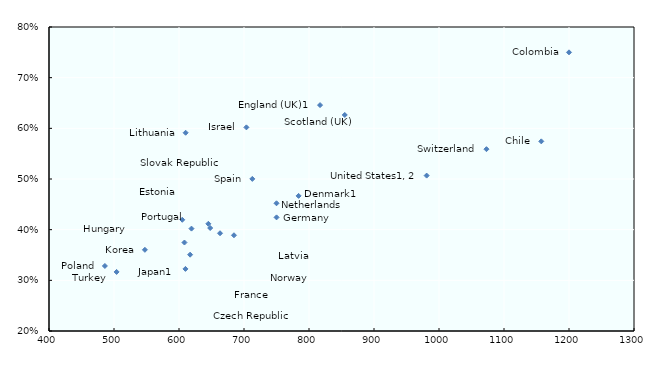
| Category | Series 8 |
|---|---|
| 1200.0 | 0.75 |
| 817.0 | 0.646 |
| 855.0 | 0.626 |
| 703.675989576588 | 0.602 |
| 610.2 | 0.591 |
| 1157.36 | 0.574 |
| 1073.0 | 0.559 |
| 981.0 | 0.507 |
| 712.8 | 0.5 |
| 784.0 | 0.467 |
| 750.0 | 0.452 |
| 750.08736073806 | 0.424 |
| 605.0 | 0.42 |
| 645.15 | 0.412 |
| 648.0 | 0.403 |
| 619.2 | 0.402 |
| 663.1 | 0.393 |
| 684.6 | 0.389 |
| 608.4 | 0.375 |
| 547.540061916256 | 0.36 |
| 617.1 | 0.351 |
| 486.0 | 0.328 |
| 609.910571 | 0.323 |
| 504.0 | 0.317 |